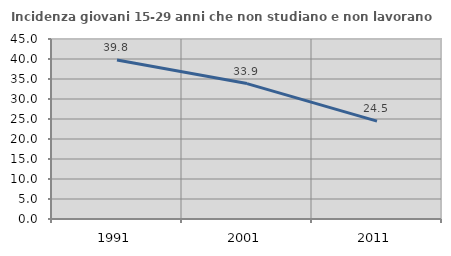
| Category | Incidenza giovani 15-29 anni che non studiano e non lavorano  |
|---|---|
| 1991.0 | 39.77 |
| 2001.0 | 33.856 |
| 2011.0 | 24.473 |